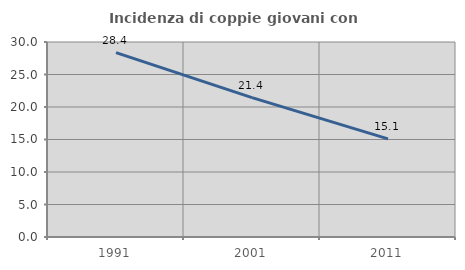
| Category | Incidenza di coppie giovani con figli |
|---|---|
| 1991.0 | 28.364 |
| 2001.0 | 21.439 |
| 2011.0 | 15.09 |